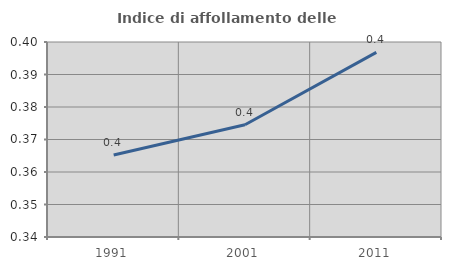
| Category | Indice di affollamento delle abitazioni  |
|---|---|
| 1991.0 | 0.365 |
| 2001.0 | 0.375 |
| 2011.0 | 0.397 |